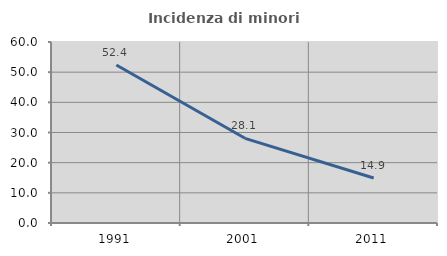
| Category | Incidenza di minori stranieri |
|---|---|
| 1991.0 | 52.381 |
| 2001.0 | 28.07 |
| 2011.0 | 14.912 |